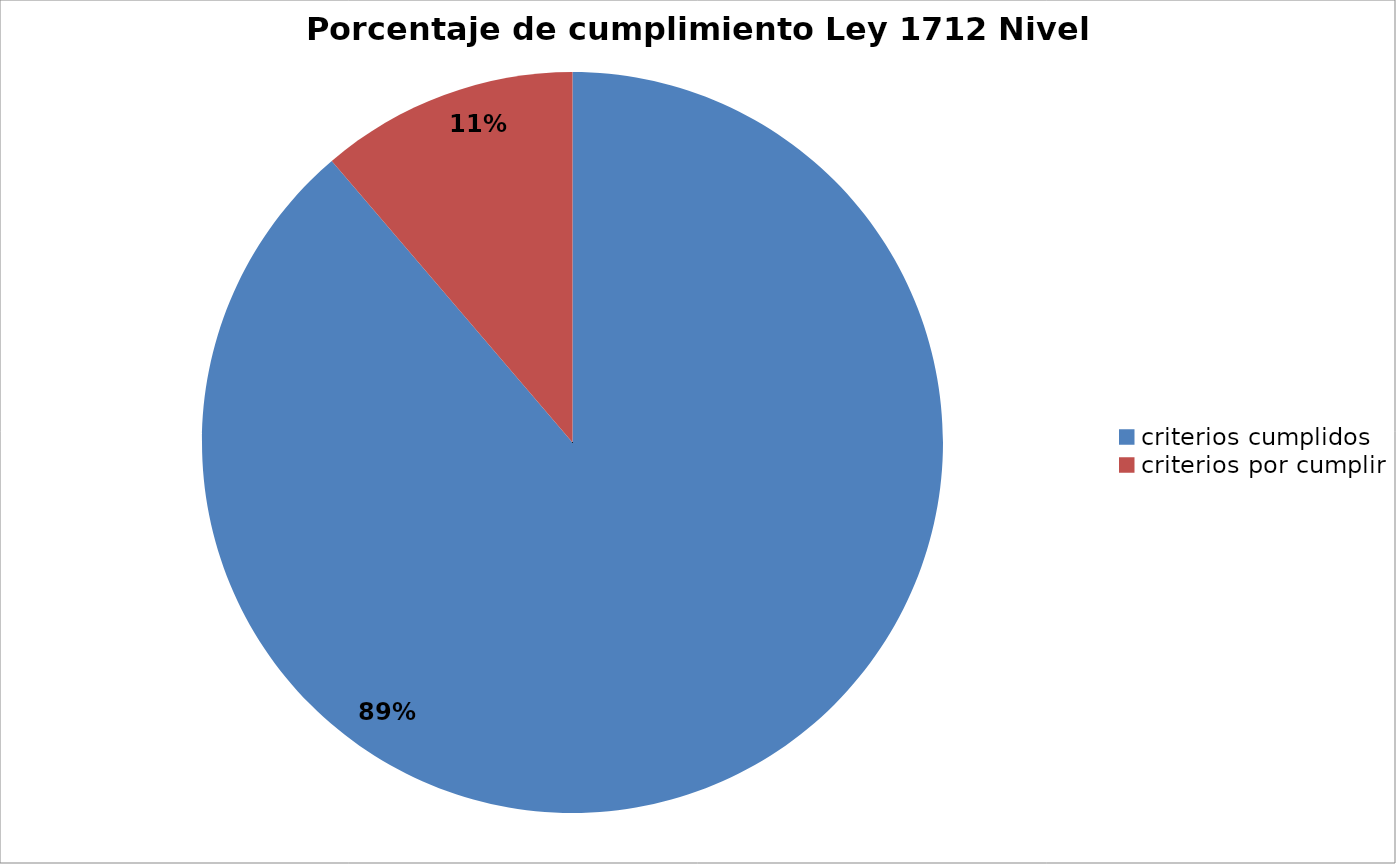
| Category | Series 0 |
|---|---|
| criterios cumplidos | 134 |
| criterios por cumplir | 17 |